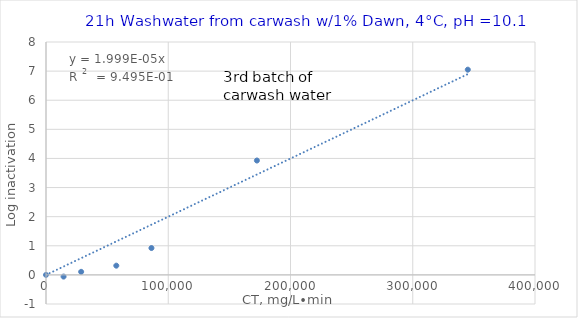
| Category | aaa |
|---|---|
| 0.0 | 0 |
| 14376.675603217156 | -0.058 |
| 28753.351206434312 | 0.105 |
| 57506.702412868624 | 0.317 |
| 86260.05361930294 | 0.922 |
| 172520.10723860588 | 3.929 |
| 345040.21447721176 | 7.049 |